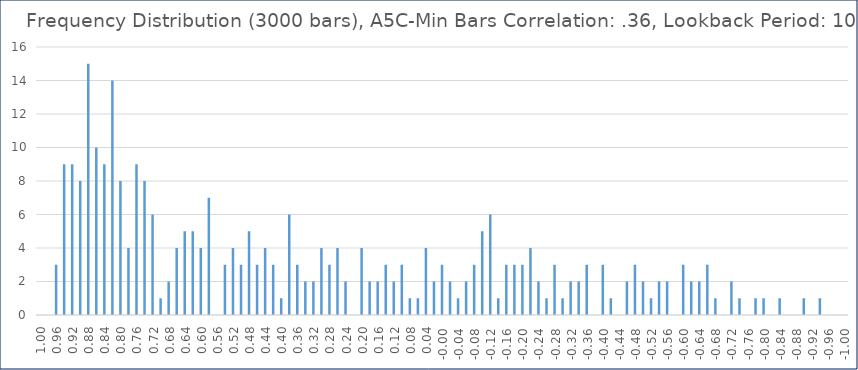
| Category | Series 0 |
|---|---|
| 1.0 | 0 |
| 0.98 | 0 |
| 0.96 | 3 |
| 0.94 | 9 |
| 0.9199999999999999 | 9 |
| 0.8999999999999999 | 8 |
| 0.8799999999999999 | 15 |
| 0.8599999999999999 | 10 |
| 0.8399999999999999 | 9 |
| 0.8199999999999998 | 14 |
| 0.7999999999999998 | 8 |
| 0.7799999999999998 | 4 |
| 0.7599999999999998 | 9 |
| 0.7399999999999998 | 8 |
| 0.7199999999999998 | 6 |
| 0.6999999999999997 | 1 |
| 0.6799999999999997 | 2 |
| 0.6599999999999997 | 4 |
| 0.6399999999999997 | 5 |
| 0.6199999999999997 | 5 |
| 0.5999999999999996 | 4 |
| 0.5799999999999996 | 7 |
| 0.5599999999999996 | 0 |
| 0.5399999999999996 | 3 |
| 0.5199999999999996 | 4 |
| 0.49999999999999956 | 3 |
| 0.47999999999999954 | 5 |
| 0.4599999999999995 | 3 |
| 0.4399999999999995 | 4 |
| 0.4199999999999995 | 3 |
| 0.39999999999999947 | 1 |
| 0.37999999999999945 | 6 |
| 0.35999999999999943 | 3 |
| 0.3399999999999994 | 2 |
| 0.3199999999999994 | 2 |
| 0.2999999999999994 | 4 |
| 0.27999999999999936 | 3 |
| 0.25999999999999934 | 4 |
| 0.23999999999999935 | 2 |
| 0.21999999999999936 | 0 |
| 0.19999999999999937 | 4 |
| 0.17999999999999938 | 2 |
| 0.1599999999999994 | 2 |
| 0.1399999999999994 | 3 |
| 0.1199999999999994 | 2 |
| 0.0999999999999994 | 3 |
| 0.07999999999999939 | 1 |
| 0.05999999999999939 | 1 |
| 0.03999999999999938 | 4 |
| 0.019999999999999383 | 2 |
| -6.175615574477433e-16 | 3 |
| -0.020000000000000618 | 2 |
| -0.04000000000000062 | 1 |
| -0.06000000000000062 | 2 |
| -0.08000000000000063 | 3 |
| -0.10000000000000063 | 5 |
| -0.12000000000000063 | 6 |
| -0.14000000000000062 | 1 |
| -0.16000000000000061 | 3 |
| -0.1800000000000006 | 3 |
| -0.2000000000000006 | 3 |
| -0.22000000000000058 | 4 |
| -0.24000000000000057 | 2 |
| -0.26000000000000056 | 1 |
| -0.2800000000000006 | 3 |
| -0.3000000000000006 | 1 |
| -0.3200000000000006 | 2 |
| -0.34000000000000064 | 2 |
| -0.36000000000000065 | 3 |
| -0.38000000000000067 | 0 |
| -0.4000000000000007 | 3 |
| -0.4200000000000007 | 1 |
| -0.4400000000000007 | 0 |
| -0.46000000000000074 | 2 |
| -0.48000000000000076 | 3 |
| -0.5000000000000008 | 2 |
| -0.5200000000000008 | 1 |
| -0.5400000000000008 | 2 |
| -0.5600000000000008 | 2 |
| -0.5800000000000008 | 0 |
| -0.6000000000000009 | 3 |
| -0.6200000000000009 | 2 |
| -0.6400000000000009 | 2 |
| -0.6600000000000009 | 3 |
| -0.6800000000000009 | 1 |
| -0.700000000000001 | 0 |
| -0.720000000000001 | 2 |
| -0.740000000000001 | 1 |
| -0.760000000000001 | 0 |
| -0.780000000000001 | 1 |
| -0.800000000000001 | 1 |
| -0.8200000000000011 | 0 |
| -0.8400000000000011 | 1 |
| -0.8600000000000011 | 0 |
| -0.8800000000000011 | 0 |
| -0.9000000000000011 | 1 |
| -0.9200000000000012 | 0 |
| -0.9400000000000012 | 1 |
| -0.9600000000000012 | 0 |
| -0.9800000000000012 | 0 |
| -1.000000000000001 | 0 |